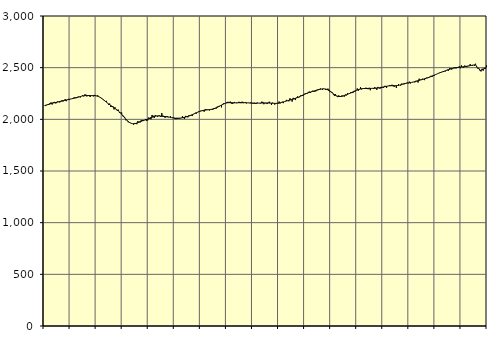
| Category | Piggar | Series 1 |
|---|---|---|
| nan | 2132.1 | 2132.97 |
| 87.0 | 2128.5 | 2135.69 |
| 87.0 | 2141 | 2138.96 |
| 87.0 | 2140.8 | 2142.5 |
| 87.0 | 2139.1 | 2145.93 |
| 87.0 | 2156.3 | 2149.32 |
| 87.0 | 2164 | 2152.46 |
| 87.0 | 2143.2 | 2155.43 |
| 87.0 | 2164.5 | 2158.13 |
| 87.0 | 2168.9 | 2160.51 |
| 87.0 | 2154.5 | 2162.75 |
| 87.0 | 2156.7 | 2164.88 |
| nan | 2172.2 | 2167.03 |
| 88.0 | 2172.7 | 2169.31 |
| 88.0 | 2163 | 2171.76 |
| 88.0 | 2178.2 | 2174.36 |
| 88.0 | 2183.4 | 2177.02 |
| 88.0 | 2172.4 | 2179.63 |
| 88.0 | 2181.8 | 2182.13 |
| 88.0 | 2196 | 2184.56 |
| 88.0 | 2175.7 | 2186.94 |
| 88.0 | 2190.5 | 2189.26 |
| 88.0 | 2198.4 | 2191.62 |
| 88.0 | 2188.4 | 2194.09 |
| nan | 2195.8 | 2196.58 |
| 89.0 | 2199.3 | 2199.08 |
| 89.0 | 2197.1 | 2201.56 |
| 89.0 | 2209.8 | 2204 |
| 89.0 | 2212.3 | 2206.47 |
| 89.0 | 2204.7 | 2209.07 |
| 89.0 | 2208 | 2211.83 |
| 89.0 | 2219.8 | 2214.73 |
| 89.0 | 2215.7 | 2217.74 |
| 89.0 | 2211.5 | 2220.74 |
| 89.0 | 2223.7 | 2223.54 |
| 89.0 | 2231.7 | 2225.95 |
| nan | 2222.5 | 2227.86 |
| 90.0 | 2240.2 | 2229.2 |
| 90.0 | 2240 | 2229.94 |
| 90.0 | 2221.6 | 2230.19 |
| 90.0 | 2228.8 | 2230.08 |
| 90.0 | 2235.4 | 2229.85 |
| 90.0 | 2216 | 2229.68 |
| 90.0 | 2227.6 | 2229.65 |
| 90.0 | 2232.4 | 2229.72 |
| 90.0 | 2221.6 | 2229.77 |
| 90.0 | 2236.4 | 2229.48 |
| 90.0 | 2232 | 2228.48 |
| nan | 2225 | 2226.56 |
| 91.0 | 2232.5 | 2223.47 |
| 91.0 | 2218.7 | 2219.16 |
| 91.0 | 2214.1 | 2213.73 |
| 91.0 | 2207.6 | 2207.29 |
| 91.0 | 2198.3 | 2199.95 |
| 91.0 | 2189.4 | 2191.89 |
| 91.0 | 2179.1 | 2183.42 |
| 91.0 | 2173.9 | 2174.77 |
| 91.0 | 2178.6 | 2166.09 |
| 91.0 | 2156 | 2157.6 |
| 91.0 | 2140.9 | 2149.36 |
| nan | 2152.1 | 2141.37 |
| 92.0 | 2119.3 | 2133.7 |
| 92.0 | 2119.3 | 2126.32 |
| 92.0 | 2126.2 | 2119.19 |
| 92.0 | 2095.5 | 2112.23 |
| 92.0 | 2115.3 | 2105.26 |
| 92.0 | 2095.5 | 2098.05 |
| 92.0 | 2082.4 | 2090.29 |
| 92.0 | 2093.1 | 2081.66 |
| 92.0 | 2063.2 | 2071.94 |
| 92.0 | 2063.8 | 2061.1 |
| 92.0 | 2065.6 | 2049.41 |
| nan | 2030 | 2037.08 |
| 93.0 | 2029.5 | 2024.46 |
| 93.0 | 2015.9 | 2012.07 |
| 93.0 | 1990.3 | 2000.15 |
| 93.0 | 1987.4 | 1989.07 |
| 93.0 | 1972.1 | 1979.31 |
| 93.0 | 1972.7 | 1971.14 |
| 93.0 | 1966.7 | 1964.81 |
| 93.0 | 1961.4 | 1960.48 |
| 93.0 | 1958.3 | 1958.1 |
| 93.0 | 1948.2 | 1957.56 |
| 93.0 | 1964.3 | 1958.63 |
| nan | 1956.8 | 1961.07 |
| 94.0 | 1953 | 1964.53 |
| 94.0 | 1983.9 | 1968.6 |
| 94.0 | 1973.3 | 1973.02 |
| 94.0 | 1968.6 | 1977.4 |
| 94.0 | 1992.3 | 1981.41 |
| 94.0 | 1993.6 | 1985.06 |
| 94.0 | 1983.2 | 1988.35 |
| 94.0 | 1992.3 | 1991.45 |
| 94.0 | 2003.5 | 1994.65 |
| 94.0 | 1986.5 | 1998.17 |
| 94.0 | 1989.1 | 2002.1 |
| nan | 2017.8 | 2006.44 |
| 95.0 | 2004.8 | 2011.16 |
| 95.0 | 1999.9 | 2015.95 |
| 95.0 | 2042.1 | 2020.47 |
| 95.0 | 2035.3 | 2024.59 |
| 95.0 | 2013.4 | 2028.05 |
| 95.0 | 2041.1 | 2030.56 |
| 95.0 | 2034 | 2032.11 |
| 95.0 | 2022.4 | 2032.75 |
| 95.0 | 2036.6 | 2032.57 |
| 95.0 | 2037.3 | 2031.8 |
| 95.0 | 2023.6 | 2030.79 |
| nan | 2061.2 | 2029.66 |
| 96.0 | 2037.2 | 2028.56 |
| 96.0 | 2030.3 | 2027.61 |
| 96.0 | 2014.3 | 2026.7 |
| 96.0 | 2022.2 | 2025.65 |
| 96.0 | 2031.6 | 2024.44 |
| 96.0 | 2020 | 2023.03 |
| 96.0 | 2021.2 | 2021.34 |
| 96.0 | 2030.1 | 2019.35 |
| 96.0 | 2018.1 | 2017.21 |
| 96.0 | 2012 | 2015.07 |
| 96.0 | 2017.6 | 2013.09 |
| nan | 2004.9 | 2011.43 |
| 97.0 | 2001.4 | 2010.22 |
| 97.0 | 2014.7 | 2009.58 |
| 97.0 | 2005 | 2009.62 |
| 97.0 | 2014.5 | 2010.33 |
| 97.0 | 2009.7 | 2011.67 |
| 97.0 | 2012.4 | 2013.51 |
| 97.0 | 2030.2 | 2015.69 |
| 97.0 | 2011.8 | 2018.02 |
| 97.0 | 2005.6 | 2020.43 |
| 97.0 | 2033.4 | 2022.98 |
| 97.0 | 2031 | 2025.71 |
| nan | 2018.9 | 2028.72 |
| 98.0 | 2038.6 | 2032.11 |
| 98.0 | 2037.9 | 2035.91 |
| 98.0 | 2042.6 | 2040.08 |
| 98.0 | 2031.9 | 2044.67 |
| 98.0 | 2047.7 | 2049.52 |
| 98.0 | 2057.8 | 2054.48 |
| 98.0 | 2063.7 | 2059.39 |
| 98.0 | 2055.9 | 2064.13 |
| 98.0 | 2070.1 | 2068.74 |
| 98.0 | 2077.3 | 2073.06 |
| 98.0 | 2073.9 | 2076.95 |
| nan | 2083 | 2080.4 |
| 99.0 | 2082.8 | 2083.35 |
| 99.0 | 2088.2 | 2085.72 |
| 99.0 | 2073.4 | 2087.64 |
| 99.0 | 2098.5 | 2089.19 |
| 99.0 | 2095.2 | 2090.46 |
| 99.0 | 2094.9 | 2091.5 |
| 99.0 | 2095.4 | 2092.51 |
| 99.0 | 2085.7 | 2093.8 |
| 99.0 | 2096.8 | 2095.5 |
| 99.0 | 2093.4 | 2097.66 |
| 99.0 | 2093.8 | 2100.31 |
| nan | 2108.9 | 2103.52 |
| 0.0 | 2108.7 | 2107.25 |
| 0.0 | 2102.9 | 2111.45 |
| 0.0 | 2122.3 | 2116.14 |
| 0.0 | 2128.1 | 2121.21 |
| 0.0 | 2130.2 | 2126.53 |
| 0.0 | 2130 | 2132.09 |
| 0.0 | 2115.7 | 2137.76 |
| 0.0 | 2148.8 | 2143.3 |
| 0.0 | 2155.2 | 2148.45 |
| 0.0 | 2151.4 | 2152.97 |
| 0.0 | 2156.2 | 2156.7 |
| nan | 2167.9 | 2159.44 |
| 1.0 | 2169.3 | 2161.15 |
| 1.0 | 2157.6 | 2161.96 |
| 1.0 | 2172 | 2161.99 |
| 1.0 | 2152.1 | 2161.45 |
| 1.0 | 2150.4 | 2160.66 |
| 1.0 | 2155.8 | 2159.93 |
| 1.0 | 2168.3 | 2159.54 |
| 1.0 | 2159.4 | 2159.58 |
| 1.0 | 2156.1 | 2159.92 |
| 1.0 | 2158.7 | 2160.47 |
| 1.0 | 2170 | 2161.09 |
| nan | 2157.3 | 2161.56 |
| 2.0 | 2156.7 | 2161.8 |
| 2.0 | 2171 | 2161.78 |
| 2.0 | 2156.1 | 2161.57 |
| 2.0 | 2163.4 | 2161.25 |
| 2.0 | 2165.9 | 2160.88 |
| 2.0 | 2154.1 | 2160.42 |
| 2.0 | 2159.3 | 2159.84 |
| 2.0 | 2158.5 | 2159.16 |
| 2.0 | 2156.7 | 2158.41 |
| 2.0 | 2163.7 | 2157.59 |
| 2.0 | 2159.6 | 2156.85 |
| nan | 2152 | 2156.29 |
| 3.0 | 2161.1 | 2156.03 |
| 3.0 | 2149.6 | 2156.08 |
| 3.0 | 2149.2 | 2156.34 |
| 3.0 | 2162 | 2156.7 |
| 3.0 | 2156.7 | 2157.05 |
| 3.0 | 2156.4 | 2157.38 |
| 3.0 | 2153 | 2157.68 |
| 3.0 | 2170.4 | 2157.93 |
| 3.0 | 2168.9 | 2158.17 |
| 3.0 | 2146.1 | 2158.37 |
| 3.0 | 2156 | 2158.48 |
| nan | 2156.4 | 2158.5 |
| 4.0 | 2147.8 | 2158.34 |
| 4.0 | 2161.1 | 2157.98 |
| 4.0 | 2170.7 | 2157.51 |
| 4.0 | 2159.3 | 2156.89 |
| 4.0 | 2139.6 | 2156.22 |
| 4.0 | 2161.3 | 2155.62 |
| 4.0 | 2154.2 | 2155.11 |
| 4.0 | 2142.4 | 2154.7 |
| 4.0 | 2153.9 | 2154.5 |
| 4.0 | 2152.5 | 2154.8 |
| 4.0 | 2152.6 | 2155.72 |
| nan | 2172.8 | 2157.27 |
| 5.0 | 2154 | 2159.54 |
| 5.0 | 2161.8 | 2162.33 |
| 5.0 | 2170.5 | 2165.35 |
| 5.0 | 2156.7 | 2168.53 |
| 5.0 | 2172.4 | 2171.77 |
| 5.0 | 2178.7 | 2174.92 |
| 5.0 | 2188.4 | 2177.95 |
| 5.0 | 2181.1 | 2180.95 |
| 5.0 | 2174.5 | 2183.91 |
| 5.0 | 2204.1 | 2186.79 |
| 5.0 | 2187.5 | 2189.67 |
| nan | 2171.5 | 2192.61 |
| 6.0 | 2207.7 | 2195.67 |
| 6.0 | 2205 | 2199 |
| 6.0 | 2186.7 | 2202.68 |
| 6.0 | 2210.5 | 2206.71 |
| 6.0 | 2221.7 | 2211.05 |
| 6.0 | 2211.6 | 2215.63 |
| 6.0 | 2213.6 | 2220.35 |
| 6.0 | 2231.9 | 2225.14 |
| 6.0 | 2233.3 | 2230.01 |
| 6.0 | 2226.2 | 2234.95 |
| 6.0 | 2238.7 | 2239.89 |
| nan | 2250.9 | 2244.8 |
| 7.0 | 2246.7 | 2249.5 |
| 7.0 | 2248.4 | 2253.8 |
| 7.0 | 2265.8 | 2257.7 |
| 7.0 | 2267.9 | 2261.23 |
| 7.0 | 2256.2 | 2264.45 |
| 7.0 | 2270.9 | 2267.46 |
| 7.0 | 2277.2 | 2270.41 |
| 7.0 | 2268.2 | 2273.42 |
| 7.0 | 2268.4 | 2276.46 |
| 7.0 | 2271.9 | 2279.54 |
| 7.0 | 2285.7 | 2282.6 |
| nan | 2292.1 | 2285.59 |
| 8.0 | 2286.4 | 2288.42 |
| 8.0 | 2299 | 2290.97 |
| 8.0 | 2293.3 | 2293.05 |
| 8.0 | 2284.6 | 2294.49 |
| 8.0 | 2297.2 | 2295.05 |
| 8.0 | 2294.8 | 2294.51 |
| 8.0 | 2283.9 | 2292.63 |
| 8.0 | 2293.6 | 2289.31 |
| 8.0 | 2297.4 | 2284.6 |
| 8.0 | 2287.5 | 2278.6 |
| 8.0 | 2265.4 | 2271.44 |
| nan | 2267 | 2263.39 |
| 9.0 | 2259.9 | 2254.95 |
| 9.0 | 2239.3 | 2246.61 |
| 9.0 | 2225.3 | 2238.9 |
| 9.0 | 2243.1 | 2232.26 |
| 9.0 | 2224.2 | 2227 |
| 9.0 | 2215.1 | 2223.3 |
| 9.0 | 2231.5 | 2221.22 |
| 9.0 | 2216.1 | 2220.69 |
| 9.0 | 2217.4 | 2221.52 |
| 9.0 | 2231.8 | 2223.43 |
| 9.0 | 2225.8 | 2226.21 |
| nan | 2219 | 2229.65 |
| 10.0 | 2239.7 | 2233.43 |
| 10.0 | 2231.6 | 2237.49 |
| 10.0 | 2252.6 | 2241.83 |
| 10.0 | 2248.5 | 2246.28 |
| 10.0 | 2247.8 | 2250.79 |
| 10.0 | 2262.4 | 2255.42 |
| 10.0 | 2254 | 2260.17 |
| 10.0 | 2255.3 | 2265.03 |
| 10.0 | 2275.4 | 2269.94 |
| 10.0 | 2269.8 | 2274.81 |
| 10.0 | 2280.5 | 2279.55 |
| nan | 2298.8 | 2284.02 |
| 11.0 | 2276.7 | 2288.04 |
| 11.0 | 2288.2 | 2291.41 |
| 11.0 | 2310.9 | 2294.07 |
| 11.0 | 2289.5 | 2296.01 |
| 11.0 | 2294.8 | 2297.29 |
| 11.0 | 2300 | 2298.03 |
| 11.0 | 2294.8 | 2298.46 |
| 11.0 | 2306.3 | 2298.72 |
| 11.0 | 2293.8 | 2298.91 |
| 11.0 | 2291.8 | 2299.08 |
| 11.0 | 2304.9 | 2299.26 |
| nan | 2281.4 | 2299.41 |
| 12.0 | 2298.6 | 2299.57 |
| 12.0 | 2298.5 | 2299.81 |
| 12.0 | 2293.6 | 2300.03 |
| 12.0 | 2310 | 2300.36 |
| 12.0 | 2305.9 | 2300.96 |
| 12.0 | 2285.3 | 2301.84 |
| 12.0 | 2313.5 | 2302.96 |
| 12.0 | 2303 | 2304.33 |
| 12.0 | 2295.8 | 2305.9 |
| 12.0 | 2313.7 | 2307.71 |
| 12.0 | 2314.1 | 2309.79 |
| nan | 2303.8 | 2312.09 |
| 13.0 | 2323.6 | 2314.65 |
| 13.0 | 2323.6 | 2317.32 |
| 13.0 | 2304.2 | 2319.83 |
| 13.0 | 2321 | 2321.92 |
| 13.0 | 2322.4 | 2323.49 |
| 13.0 | 2331.2 | 2324.5 |
| 13.0 | 2328 | 2325.01 |
| 13.0 | 2335 | 2325.12 |
| 13.0 | 2332 | 2325.07 |
| 13.0 | 2313.6 | 2325.04 |
| 13.0 | 2329.1 | 2325.2 |
| nan | 2304.2 | 2325.79 |
| 14.0 | 2325.3 | 2326.93 |
| 14.0 | 2341.4 | 2328.7 |
| 14.0 | 2331.2 | 2331.17 |
| 14.0 | 2326.9 | 2334.22 |
| 14.0 | 2347.3 | 2337.55 |
| 14.0 | 2340.8 | 2340.9 |
| 14.0 | 2337.9 | 2343.99 |
| 14.0 | 2350.2 | 2346.67 |
| 14.0 | 2348.2 | 2348.98 |
| 14.0 | 2355.5 | 2350.94 |
| 14.0 | 2347.8 | 2352.67 |
| nan | 2364.9 | 2354.28 |
| 15.0 | 2347.3 | 2355.92 |
| 15.0 | 2357.7 | 2357.61 |
| 15.0 | 2361 | 2359.55 |
| 15.0 | 2362 | 2361.85 |
| 15.0 | 2357.6 | 2364.46 |
| 15.0 | 2373 | 2367.33 |
| 15.0 | 2371.6 | 2370.46 |
| 15.0 | 2356 | 2373.73 |
| 15.0 | 2393.1 | 2376.97 |
| 15.0 | 2384.2 | 2380.15 |
| 15.0 | 2380 | 2383.23 |
| nan | 2393.4 | 2386.25 |
| 16.0 | 2386.8 | 2389.23 |
| 16.0 | 2379.4 | 2392.29 |
| 16.0 | 2400.6 | 2395.45 |
| 16.0 | 2403.4 | 2398.77 |
| 16.0 | 2399 | 2402.29 |
| 16.0 | 2402.4 | 2406.04 |
| 16.0 | 2412.7 | 2410.03 |
| 16.0 | 2421.5 | 2414.28 |
| 16.0 | 2410.5 | 2418.75 |
| 16.0 | 2429.4 | 2423.32 |
| 16.0 | 2421.6 | 2428.01 |
| nan | 2433.3 | 2432.72 |
| 17.0 | 2435.8 | 2437.41 |
| 17.0 | 2442.2 | 2441.98 |
| 17.0 | 2448.5 | 2446.34 |
| 17.0 | 2452.2 | 2450.44 |
| 17.0 | 2457.8 | 2454.33 |
| 17.0 | 2458.8 | 2458.08 |
| 17.0 | 2461.6 | 2461.69 |
| 17.0 | 2463.9 | 2465.25 |
| 17.0 | 2463 | 2468.84 |
| 17.0 | 2470 | 2472.55 |
| 17.0 | 2481 | 2476.29 |
| nan | 2470.7 | 2480.08 |
| 18.0 | 2495 | 2483.75 |
| 18.0 | 2492.2 | 2487.2 |
| 18.0 | 2481.6 | 2490.41 |
| 18.0 | 2494.2 | 2493.24 |
| 18.0 | 2499.3 | 2495.71 |
| 18.0 | 2502.1 | 2497.87 |
| 18.0 | 2492.8 | 2499.76 |
| 18.0 | 2501.5 | 2501.43 |
| 18.0 | 2499 | 2502.87 |
| 18.0 | 2513.2 | 2504.12 |
| 18.0 | 2494.2 | 2505.28 |
| nan | 2521.7 | 2506.44 |
| 19.0 | 2503.7 | 2507.71 |
| 19.0 | 2500.6 | 2509.05 |
| 19.0 | 2520.9 | 2510.47 |
| 19.0 | 2506.3 | 2512.03 |
| 19.0 | 2505.4 | 2513.68 |
| 19.0 | 2516.8 | 2515.42 |
| 19.0 | 2516 | 2517.32 |
| 19.0 | 2534.5 | 2519.32 |
| 19.0 | 2522.1 | 2521.37 |
| 19.0 | 2516.4 | 2523.37 |
| 19.0 | 2525 | 2525.3 |
| nan | 2516.4 | 2527.07 |
| 20.0 | 2538.1 | 2528.71 |
| 20.0 | 2513.5 | 2507.38 |
| 20.0 | 2489.5 | 2492.2 |
| 20.0 | 2496.4 | 2494.79 |
| 20.0 | 2474.6 | 2472.16 |
| 20.0 | 2463.5 | 2476.17 |
| 20.0 | 2489.9 | 2480.82 |
| 20.0 | 2470.3 | 2486.02 |
| 20.0 | 2498.3 | 2491.66 |
| 20.0 | 2487.1 | 2497.66 |
| 20.0 | 2522.3 | 2503.83 |